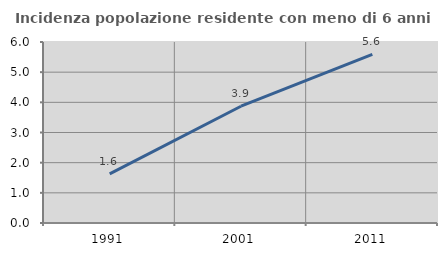
| Category | Incidenza popolazione residente con meno di 6 anni |
|---|---|
| 1991.0 | 1.63 |
| 2001.0 | 3.871 |
| 2011.0 | 5.59 |